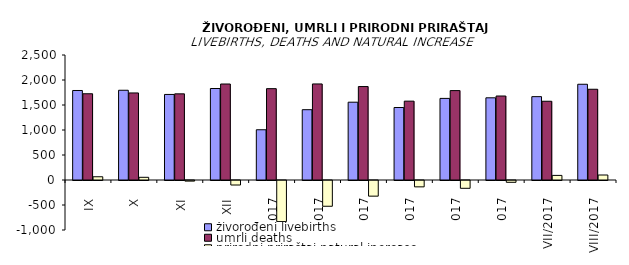
| Category | živorođeni livebirths | umrli deaths | prirodni priraštaj natural increase |
|---|---|---|---|
| IX | 1790 | 1725 | 65 |
| X | 1795 | 1741 | 54 |
| XI | 1711 | 1723 | -12 |
| XII | 1830 | 1920 | -90 |
| I/2017 | 1005 | 1827 | -822 |
| II/2017 | 1406 | 1921 | -515 |
| III/2017 | 1556 | 1869 | -313 |
| IV/2017 | 1450 | 1577 | -127 |
| V/2017 | 1632 | 1788 | -156 |
| VI/2017 | 1644 | 1680 | -36 |
| VII/2017 | 1667 | 1575 | 92 |
| VIII/2017 | 1915 | 1815 | 100 |